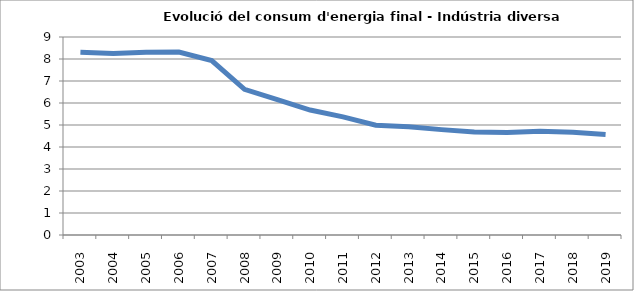
| Category | 8,3 |
|---|---|
| 2003.0 | 8.31 |
| 2004.0 | 8.25 |
| 2005.0 | 8.31 |
| 2006.0 | 8.32 |
| 2007.0 | 7.93 |
| 2008.0 | 6.62 |
| 2009.0 | 6.15 |
| 2010.0 | 5.68 |
| 2011.0 | 5.37 |
| 2012.0 | 4.99 |
| 2013.0 | 4.92 |
| 2014.0 | 4.79 |
| 2015.0 | 4.68 |
| 2016.0 | 4.66 |
| 2017.0 | 4.72 |
| 2018.0 | 4.67 |
| 2019.0 | 4.57 |